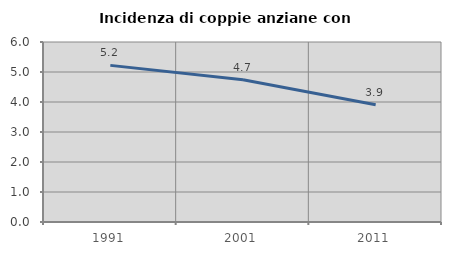
| Category | Incidenza di coppie anziane con figli |
|---|---|
| 1991.0 | 5.221 |
| 2001.0 | 4.743 |
| 2011.0 | 3.906 |